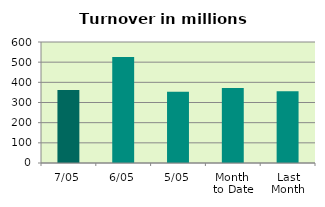
| Category | Series 0 |
|---|---|
| 7/05 | 361.627 |
| 6/05 | 525.69 |
| 5/05 | 353.217 |
| Month 
to Date | 372.289 |
| Last
Month | 356.105 |